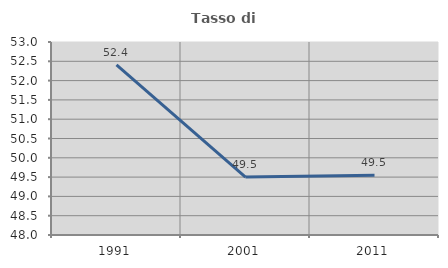
| Category | Tasso di occupazione   |
|---|---|
| 1991.0 | 52.407 |
| 2001.0 | 49.502 |
| 2011.0 | 49.549 |